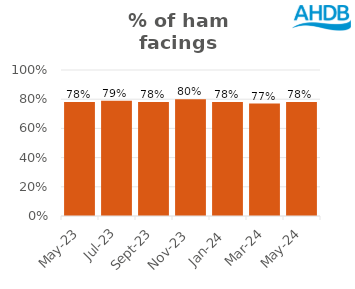
| Category | Ham |
|---|---|
| 2023-05-01 | 0.78 |
| 2023-07-01 | 0.79 |
| 2023-09-01 | 0.78 |
| 2023-11-01 | 0.8 |
| 2024-01-01 | 0.78 |
| 2024-03-01 | 0.77 |
| 2024-05-01 | 0.78 |